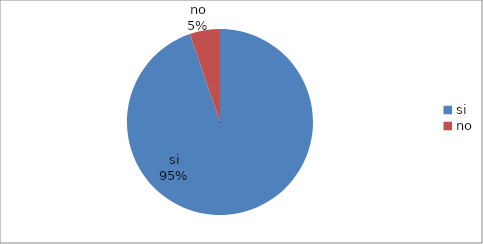
| Category | Series 0 |
|---|---|
| si | 379 |
| no | 21 |